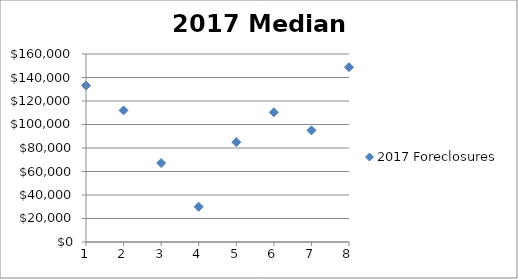
| Category | 2017 Foreclosures |
|---|---|
| 1.0 | 133182 |
| 2.0 | 112000 |
| 3.0 | 67175 |
| 4.0 | 30000 |
| 5.0 | 85000 |
| 6.0 | 110400 |
| 7.0 | 95000 |
| 8.0 | 148780 |